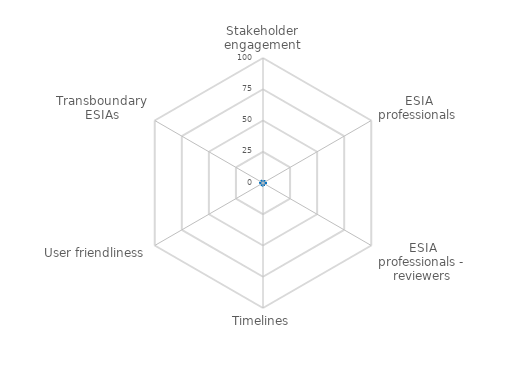
| Category | Series 0 | Series 1 |
|---|---|---|
| Stakeholder engagement | 0 | 0 |
| ESIA professionals | 0 | 0 |
| ESIA professionals - reviewers | 0 | 0 |
| Timelines | 0 | 0 |
| User friendliness | 0 | 0 |
| Transboundary ESIAs | 0 | 0 |